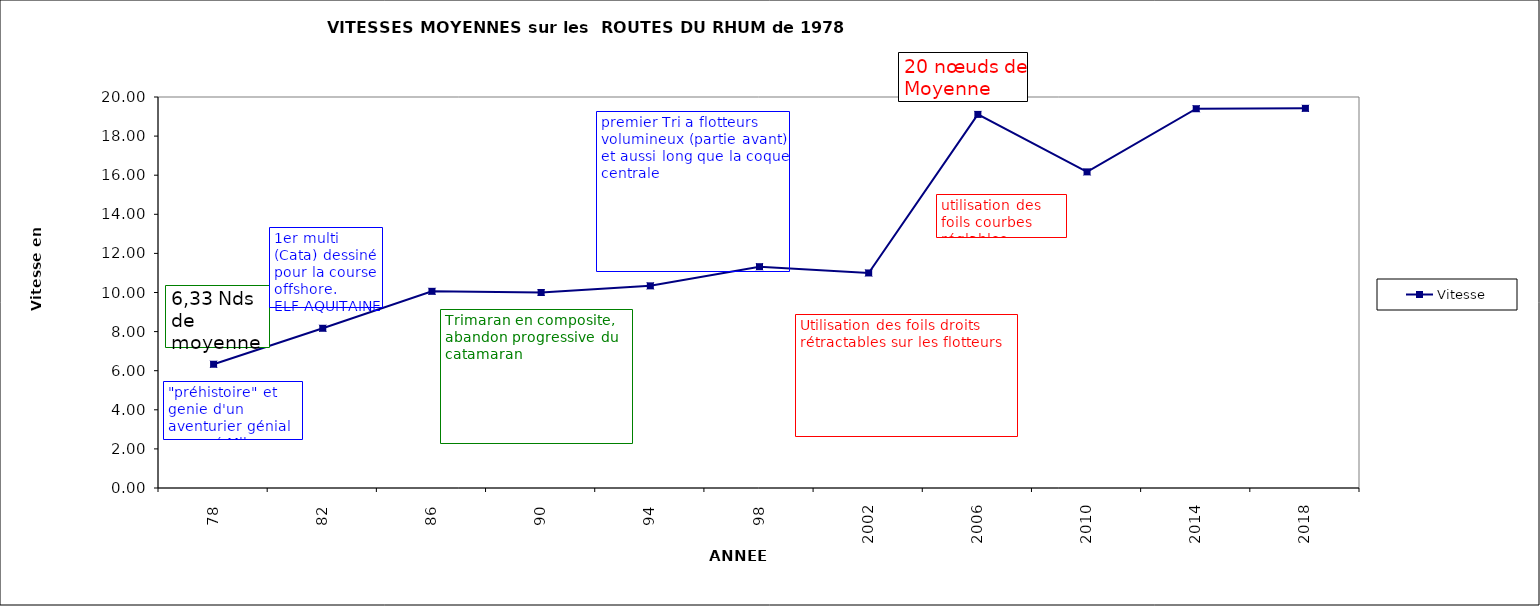
| Category | Vitesse |
|---|---|
| 78.0 | 6.33 |
| 82.0 | 8.17 |
| 86.0 | 10.06 |
| 90.0 | 10 |
| 94.0 | 10.34 |
| 98.0 | 11.32 |
| 2002.0 | 11 |
| 2006.0 | 19.11 |
| 2010.0 | 16.17 |
| 2014.0 | 19.4 |
| 2018.0 | 19.42 |